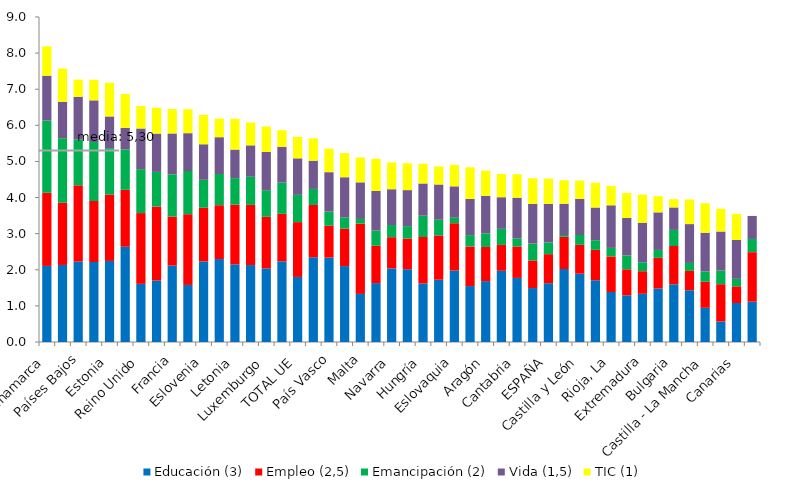
| Category | Educación (3) | Empleo (2,5) | Emancipación (2) | Vida (1,5) | TIC (1) |
|---|---|---|---|---|---|
| Dinamarca | 2.107 | 2.026 | 2 | 1.242 | 0.812 |
| Finlandia | 2.133 | 1.722 | 1.789 | 1.008 | 0.92 |
| Países Bajos | 2.227 | 2.113 | 1.268 | 1.184 | 0.475 |
| Suecia | 2.215 | 1.69 | 1.633 | 1.154 | 0.569 |
| Estonia | 2.245 | 1.835 | 1.289 | 0.877 | 0.933 |
| Lituania | 2.637 | 1.578 | 1.115 | 0.598 | 0.941 |
| Reino Unido | 1.61 | 1.96 | 1.217 | 1.126 | 0.621 |
| Austria | 1.703 | 2.049 | 0.959 | 1.06 | 0.717 |
| Francia | 2.116 | 1.356 | 1.171 | 1.132 | 0.676 |
| Alemania | 1.581 | 1.959 | 1.196 | 1.048 | 0.664 |
| Eslovenia | 2.231 | 1.486 | 0.775 | 0.984 | 0.811 |
| Bélgica | 2.297 | 1.491 | 0.864 | 1.02 | 0.515 |
| Letonia | 2.15 | 1.653 | 0.734 | 0.79 | 0.85 |
| Rep. Checa | 2.131 | 1.667 | 0.778 | 0.871 | 0.633 |
| Luxemburgo | 2.039 | 1.428 | 0.737 | 1.057 | 0.705 |
| Irlanda | 2.233 | 1.317 | 0.863 | 0.994 | 0.458 |
| TOTAL UE | 1.802 | 1.518 | 0.755 | 1.012 | 0.593 |
| Polonia | 2.347 | 1.448 | 0.444 | 0.783 | 0.621 |
| País Vasco | 2.337 | 0.883 | 0.391 | 1.092 | 0.653 |
| Madrid | 2.102 | 1.036 | 0.315 | 1.11 | 0.669 |
| Malta | 1.332 | 1.946 | 0.129 | 1.014 | 0.688 |
| Cataluña | 1.631 | 1.034 | 0.421 | 1.098 | 0.889 |
| Navarra | 2.038 | 0.864 | 0.337 | 0.992 | 0.743 |
| Asturias | 2.016 | 0.849 | 0.344 | 0.997 | 0.741 |
| Hungría | 1.621 | 1.287 | 0.59 | 0.892 | 0.549 |
| Chipre | 1.725 | 1.227 | 0.434 | 0.977 | 0.499 |
| Eslovaquia | 1.98 | 1.31 | 0.151 | 0.87 | 0.597 |
| Portugal | 1.549 | 1.096 | 0.316 | 1.002 | 0.877 |
| Aragón | 1.686 | 0.947 | 0.374 | 1.043 | 0.694 |
| Grecia | 1.972 | 0.717 | 0.445 | 0.876 | 0.645 |
| Cantabria | 1.775 | 0.871 | 0.224 | 1.126 | 0.649 |
| Com. Valenciana | 1.494 | 0.764 | 0.469 | 1.094 | 0.712 |
| ESPAÑA | 1.628 | 0.805 | 0.323 | 1.066 | 0.701 |
| Croacia | 2.022 | 0.891 | 0.051 | 0.867 | 0.65 |
| Castilla y León | 1.891 | 0.8 | 0.272 | 1.001 | 0.508 |
| Galicia | 1.71 | 0.842 | 0.267 | 0.905 | 0.686 |
| Rioja, La | 1.385 | 0.984 | 0.237 | 1.18 | 0.536 |
| Murcia | 1.292 | 0.721 | 0.384 | 1.039 | 0.687 |
| Extremadura | 1.335 | 0.625 | 0.248 | 1.096 | 0.778 |
| Italia | 1.482 | 0.848 | 0.22 | 1.04 | 0.447 |
| Bulgaria | 1.595 | 1.064 | 0.445 | 0.622 | 0.229 |
| Andalucía | 1.432 | 0.537 | 0.22 | 1.076 | 0.683 |
| Castilla - La Mancha | 0.947 | 0.722 | 0.286 | 1.073 | 0.817 |
| Balears | 0.566 | 1.034 | 0.378 | 1.082 | 0.63 |
| Canarias | 1.081 | 0.461 | 0.207 | 1.078 | 0.722 |
| Rumania | 1.117 | 1.37 | 0.367 | 0.637 | 0 |